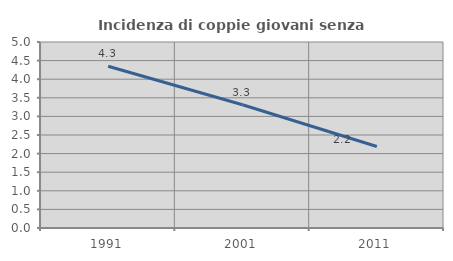
| Category | Incidenza di coppie giovani senza figli |
|---|---|
| 1991.0 | 4.348 |
| 2001.0 | 3.313 |
| 2011.0 | 2.191 |